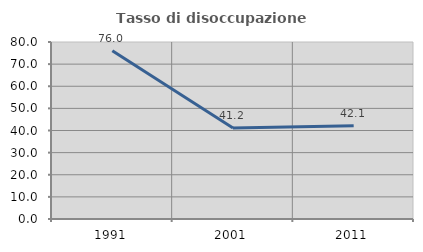
| Category | Tasso di disoccupazione giovanile  |
|---|---|
| 1991.0 | 76 |
| 2001.0 | 41.176 |
| 2011.0 | 42.105 |